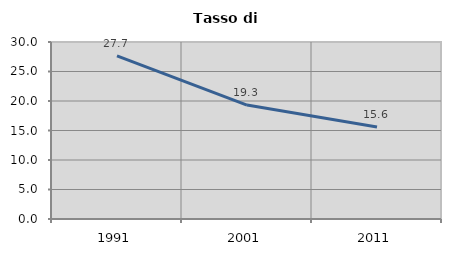
| Category | Tasso di disoccupazione   |
|---|---|
| 1991.0 | 27.661 |
| 2001.0 | 19.314 |
| 2011.0 | 15.598 |